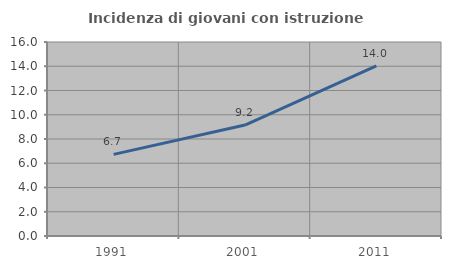
| Category | Incidenza di giovani con istruzione universitaria |
|---|---|
| 1991.0 | 6.731 |
| 2001.0 | 9.153 |
| 2011.0 | 14.022 |